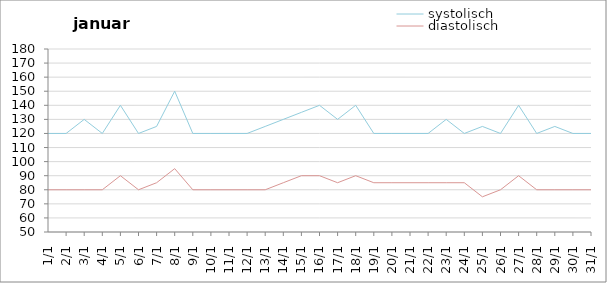
| Category | systolisch | diastolisch |
|---|---|---|
| 2011-01-01 | 120 | 80 |
| 2011-01-02 | 120 | 80 |
| 2011-01-03 | 130 | 80 |
| 2011-01-04 | 120 | 80 |
| 2011-01-05 | 140 | 90 |
| 2011-01-06 | 120 | 80 |
| 2011-01-07 | 125 | 85 |
| 2011-01-08 | 150 | 95 |
| 2011-01-09 | 120 | 80 |
| 2011-01-10 | 120 | 80 |
| 2011-01-11 | 120 | 80 |
| 2011-01-12 | 120 | 80 |
| 2011-01-13 | 125 | 80 |
| 2011-01-14 | 130 | 85 |
| 2011-01-15 | 135 | 90 |
| 2011-01-16 | 140 | 90 |
| 2011-01-17 | 130 | 85 |
| 2011-01-18 | 140 | 90 |
| 2011-01-19 | 120 | 85 |
| 2011-01-20 | 120 | 85 |
| 2011-01-21 | 120 | 85 |
| 2011-01-22 | 120 | 85 |
| 2011-01-23 | 130 | 85 |
| 2011-01-24 | 120 | 85 |
| 2011-01-25 | 125 | 75 |
| 2011-01-26 | 120 | 80 |
| 2011-01-27 | 140 | 90 |
| 2011-01-28 | 120 | 80 |
| 2011-01-29 | 125 | 80 |
| 2011-01-30 | 120 | 80 |
| 2011-01-31 | 120 | 80 |